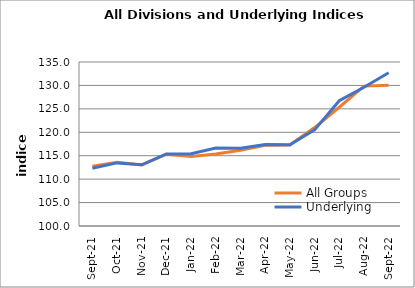
| Category | All Groups | Underlying |
|---|---|---|
| 2021-09-01 | 112.778 | 112.306 |
| 2021-10-01 | 113.609 | 113.469 |
| 2021-11-01 | 113.04 | 113.069 |
| 2021-12-01 | 115.331 | 115.373 |
| 2022-01-01 | 114.841 | 115.444 |
| 2022-02-01 | 115.348 | 116.622 |
| 2022-03-01 | 116.161 | 116.584 |
| 2022-04-01 | 117.224 | 117.408 |
| 2022-05-01 | 117.307 | 117.326 |
| 2022-06-01 | 121.013 | 120.516 |
| 2022-07-01 | 125.348 | 126.726 |
| 2022-08-01 | 129.854 | 129.6 |
| 2022-09-01 | 130.056 | 132.699 |